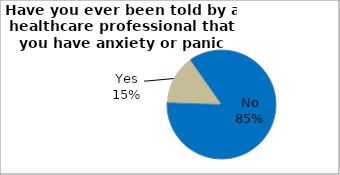
| Category | Series 0 |
|---|---|
| No | 85.244 |
| Yes | 14.756 |